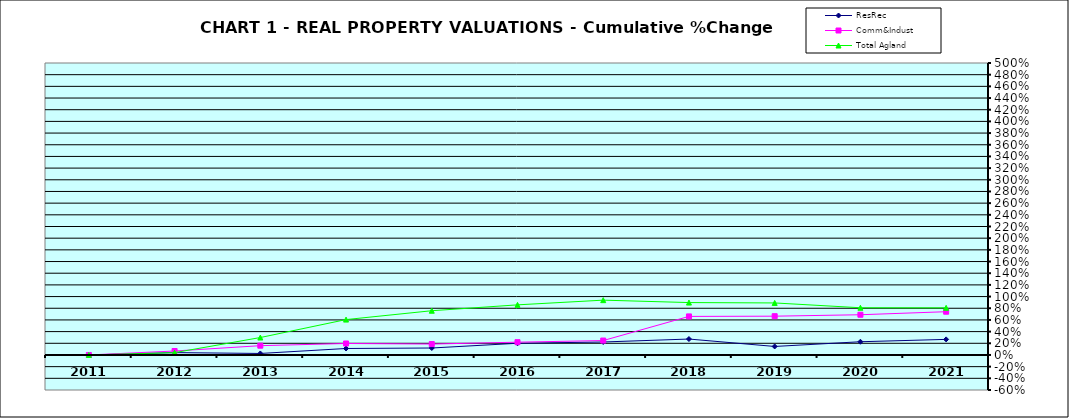
| Category | ResRec | Comm&Indust | Total Agland |
|---|---|---|---|
| 2011.0 | 0 | 0 | 0 |
| 2012.0 | 0.04 | 0.068 | 0.04 |
| 2013.0 | 0.026 | 0.159 | 0.298 |
| 2014.0 | 0.111 | 0.196 | 0.606 |
| 2015.0 | 0.119 | 0.187 | 0.758 |
| 2016.0 | 0.2 | 0.219 | 0.858 |
| 2017.0 | 0.222 | 0.247 | 0.939 |
| 2018.0 | 0.273 | 0.66 | 0.897 |
| 2019.0 | 0.146 | 0.664 | 0.891 |
| 2020.0 | 0.226 | 0.689 | 0.808 |
| 2021.0 | 0.267 | 0.741 | 0.807 |